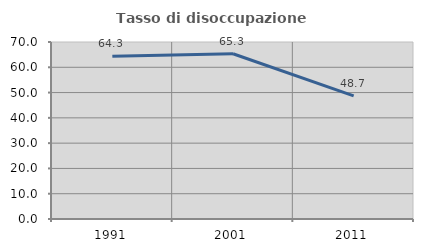
| Category | Tasso di disoccupazione giovanile  |
|---|---|
| 1991.0 | 64.327 |
| 2001.0 | 65.347 |
| 2011.0 | 48.718 |